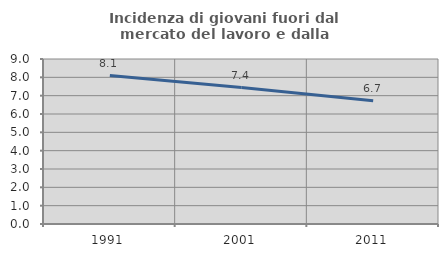
| Category | Incidenza di giovani fuori dal mercato del lavoro e dalla formazione  |
|---|---|
| 1991.0 | 8.095 |
| 2001.0 | 7.443 |
| 2011.0 | 6.728 |